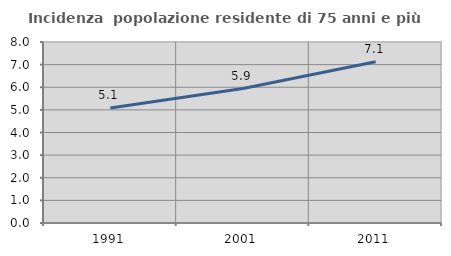
| Category | Incidenza  popolazione residente di 75 anni e più |
|---|---|
| 1991.0 | 5.088 |
| 2001.0 | 5.943 |
| 2011.0 | 7.124 |